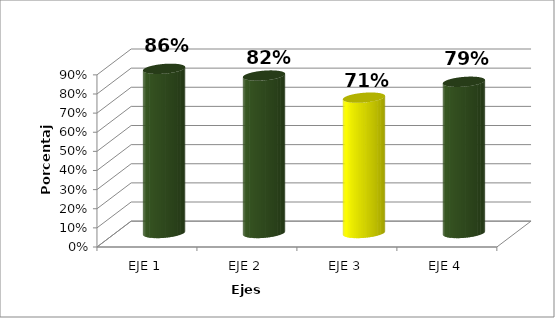
| Category | Series 0 |
|---|---|
| EJE 1 | 0.858 |
| EJE 2 | 0.823 |
| EJE 3 | 0.708 |
| EJE 4 | 0.791 |